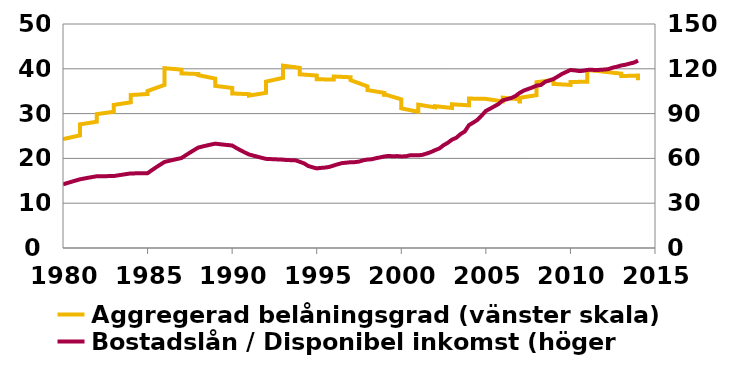
| Category | Aggregerad belåningsgrad (vänster skala) |
|---|---|
| 12/31/80 | 24.309 |
| 3/31/81 | 25.137 |
| 6/30/81 | 25.961 |
| 9/30/81 | 26.781 |
| 12/31/81 | 27.598 |
| 3/31/82 | 28.189 |
| 6/30/82 | 28.767 |
| 9/30/82 | 29.333 |
| 12/31/82 | 29.886 |
| 3/31/83 | 30.413 |
| 6/30/83 | 30.931 |
| 9/30/83 | 31.44 |
| 12/31/83 | 31.94 |
| 3/31/84 | 32.512 |
| 6/30/84 | 33.069 |
| 9/30/84 | 33.612 |
| 12/31/84 | 34.142 |
| 3/31/85 | 34.378 |
| 6/30/85 | 34.607 |
| 9/30/85 | 34.828 |
| 12/31/85 | 35.042 |
| 3/31/86 | 36.396 |
| 6/30/86 | 37.695 |
| 9/30/86 | 38.942 |
| 12/31/86 | 40.139 |
| 3/31/87 | 39.815 |
| 6/30/87 | 39.516 |
| 9/30/87 | 39.239 |
| 12/31/87 | 38.981 |
| 3/31/88 | 38.833 |
| 6/30/88 | 38.699 |
| 9/30/88 | 38.577 |
| 12/31/88 | 38.465 |
| 3/31/89 | 37.811 |
| 6/30/89 | 37.219 |
| 9/30/89 | 36.681 |
| 12/31/89 | 36.189 |
| 3/31/90 | 35.718 |
| 6/30/90 | 35.282 |
| 9/30/90 | 34.877 |
| 12/31/90 | 34.5 |
| 3/31/91 | 34.334 |
| 6/30/91 | 34.175 |
| 9/30/91 | 34.021 |
| 12/31/91 | 33.873 |
| 3/31/92 | 34.637 |
| 6/30/92 | 35.434 |
| 9/30/92 | 36.268 |
| 12/31/92 | 37.141 |
| 3/31/93 | 37.978 |
| 6/30/93 | 38.85 |
| 9/30/93 | 39.76 |
| 12/31/93 | 40.71 |
| 3/31/94 | 40.209 |
| 6/30/94 | 39.719 |
| 9/30/94 | 39.239 |
| 12/31/94 | 38.769 |
| 3/31/95 | 38.494 |
| 6/30/95 | 38.216 |
| 9/30/95 | 37.935 |
| 12/31/95 | 37.652 |
| 3/31/96 | 37.622 |
| 6/30/96 | 37.831 |
| 9/30/96 | 38.048 |
| 12/31/96 | 38.28 |
| 3/31/97 | 38.115 |
| 6/30/97 | 37.789 |
| 9/30/97 | 37.469 |
| 12/31/97 | 37.337 |
| 3/31/98 | 36.081 |
| 6/30/98 | 35.254 |
| 9/30/98 | 35.127 |
| 12/31/98 | 35.283 |
| 3/31/99 | 34.629 |
| 6/30/99 | 34.2 |
| 9/30/99 | 33.828 |
| 12/31/99 | 34.325 |
| 3/31/00 | 33.184 |
| 6/30/00 | 31.855 |
| 9/30/00 | 31.181 |
| 12/31/00 | 31.065 |
| 3/31/01 | 30.391 |
| 6/30/01 | 30.876 |
| 9/30/01 | 31.572 |
| 12/31/01 | 31.996 |
| 3/31/02 | 31.397 |
| 6/30/02 | 31.366 |
| 9/30/02 | 31.653 |
| 12/31/02 | 31.688 |
| 3/31/03 | 31.256 |
| 6/30/03 | 31.547 |
| 9/30/03 | 31.676 |
| 12/31/03 | 32.072 |
| 3/31/04 | 31.854 |
| 6/30/04 | 31.891 |
| 9/30/04 | 31.921 |
| 12/31/04 | 33.359 |
| 3/31/05 | 33.286 |
| 6/30/05 | 33.355 |
| 9/30/05 | 33.074 |
| 12/31/05 | 33.426 |
| 3/31/06 | 32.736 |
| 6/30/06 | 32.648 |
| 9/30/06 | 32.718 |
| 12/31/06 | 33.556 |
| 3/31/07 | 33.185 |
| 6/30/07 | 32.329 |
| 9/30/07 | 32.276 |
| 12/31/07 | 33.52 |
| 3/31/08 | 34.119 |
| 6/30/08 | 34.622 |
| 9/30/08 | 35.404 |
| 12/31/08 | 37.015 |
| 3/31/09 | 37.514 |
| 6/30/09 | 36.977 |
| 9/30/09 | 36.618 |
| 12/31/09 | 36.583 |
| 3/31/10 | 36.414 |
| 6/30/10 | 36.33 |
| 9/30/10 | 36.674 |
| 12/31/10 | 37.066 |
| 3/31/11 | 37.098 |
| 6/30/11 | 37.65 |
| 9/30/11 | 38.269 |
| 12/31/11 | 39.72 |
| 3/31/12 | 39.378 |
| 6/30/12 | 39.166 |
| 9/30/12 | 39.022 |
| 12/31/12 | 39.352 |
| 3/31/13 | 38.916 |
| 6/30/13 | 38.379 |
| 9/30/13 | 38.275 |
| 12/31/13 | 38.514 |
| 3/31/14 | 38.488 |
| 6/30/14 | 37.898 |
| 9/30/14 | 37.435 |
| 12/31/14 | 37.644 |